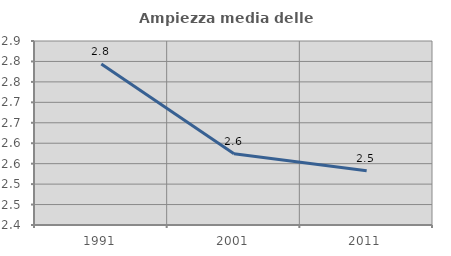
| Category | Ampiezza media delle famiglie |
|---|---|
| 1991.0 | 2.794 |
| 2001.0 | 2.574 |
| 2011.0 | 2.533 |